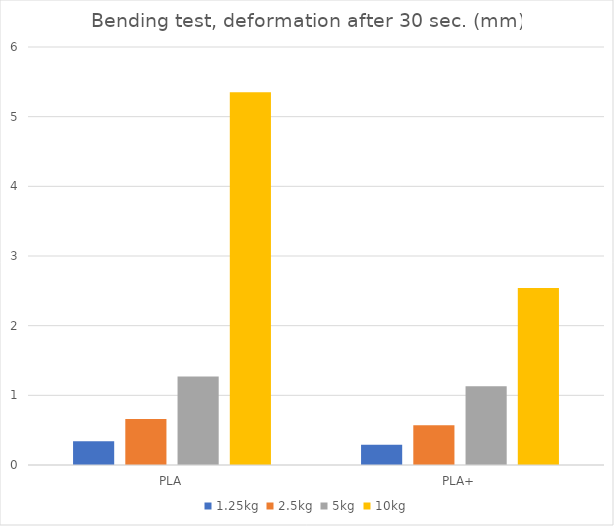
| Category | 1.25kg | 2.5kg | 5kg | 10kg |
|---|---|---|---|---|
| PLA | 0.34 | 0.66 | 1.27 | 5.35 |
| PLA+ | 0.29 | 0.57 | 1.13 | 2.54 |